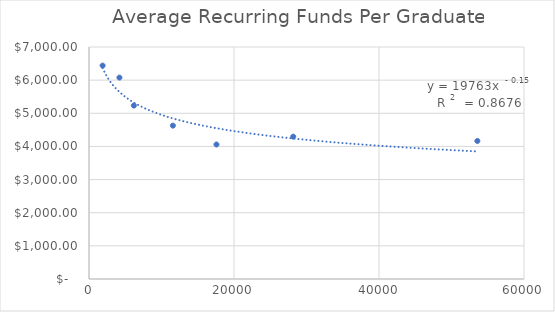
| Category | Average Recurring Funds Per Graduate |
|---|---|
| 1877.1333333333332 | 6439.374 |
| 4199.033333333334 | 6077.168 |
| 6186.875 | 5233.43 |
| 11570.24 | 4627.457 |
| 17581.383333333335 | 4058.348 |
| 28166.824999999997 | 4295.065 |
| 53567.666666666664 | 4165.035 |